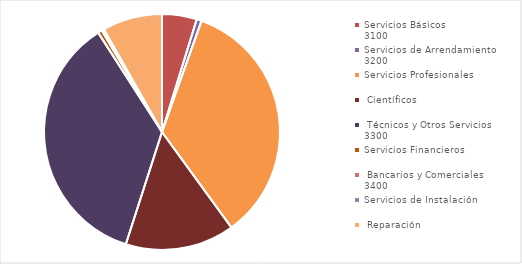
| Category | Importe |
|---|---|
| 0 | 145663929 |
| 1 | 20720361 |
| 2 | 1058483629 |
| 3 | 458257843 |
| 4 | 1100766022 |
| 5 | 17484698.88 |
| 6 | 3523278 |
| 7 | 6267997.19 |
| 8 | 251151682.87 |